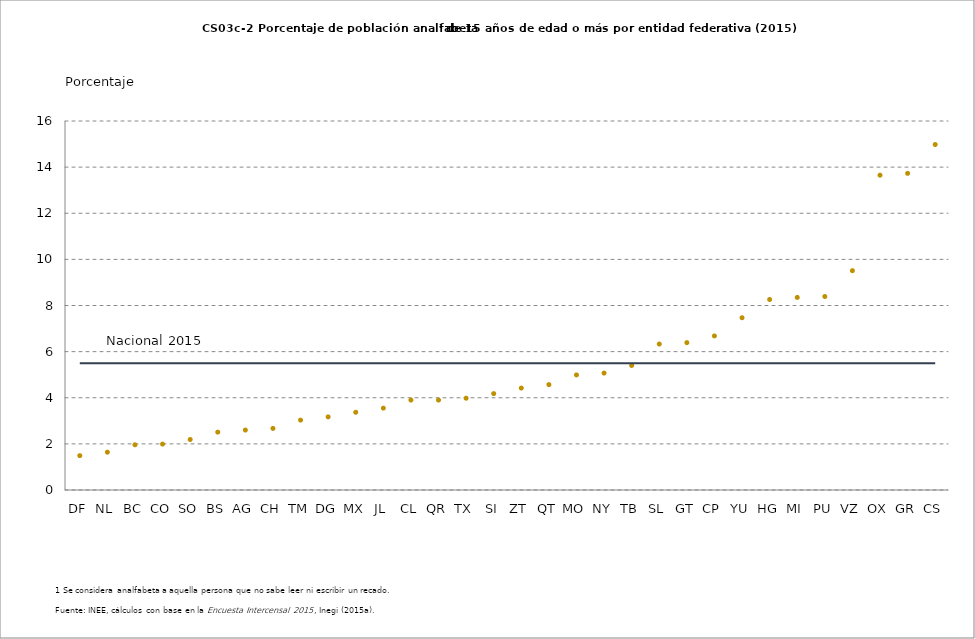
| Category | 2015 | Nal 2015 |
|---|---|---|
| DF | 1.49 | 5.5 |
| NL | 1.64 | 5.5 |
| BC | 1.96 | 5.5 |
| CO | 1.99 | 5.5 |
| SO | 2.19 | 5.5 |
| BS | 2.51 | 5.5 |
| AG | 2.6 | 5.5 |
| CH | 2.67 | 5.5 |
| TM | 3.03 | 5.5 |
| DG | 3.17 | 5.5 |
| MX | 3.37 | 5.5 |
| JL | 3.55 | 5.5 |
| CL | 3.9 | 5.5 |
| QR | 3.9 | 5.5 |
| TX | 3.98 | 5.5 |
| SI | 4.18 | 5.5 |
| ZT | 4.42 | 5.5 |
| QT | 4.57 | 5.5 |
| MO | 4.99 | 5.5 |
| NY | 5.07 | 5.5 |
| TB | 5.4 | 5.5 |
| SL | 6.33 | 5.5 |
| GT | 6.39 | 5.5 |
| CP | 6.68 | 5.5 |
| YU | 7.47 | 5.5 |
| HG | 8.26 | 5.5 |
| MI | 8.35 | 5.5 |
| PU | 8.39 | 5.5 |
| VZ | 9.51 | 5.5 |
| OX | 13.65 | 5.5 |
| GR | 13.73 | 5.5 |
| CS | 14.98 | 5.5 |